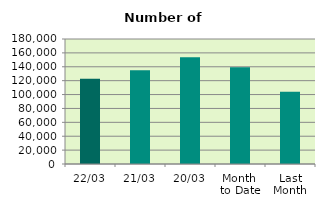
| Category | Series 0 |
|---|---|
| 22/03 | 122600 |
| 21/03 | 135044 |
| 20/03 | 153692 |
| Month 
to Date | 139415.875 |
| Last
Month | 103910.7 |